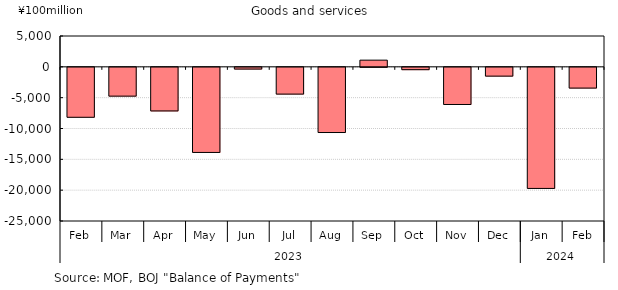
| Category | Series 0 |
|---|---|
| 0 | -8101 |
| 1 | -4671 |
| 2 | -7069 |
| 3 | -13801 |
| 4 | -282 |
| 5 | -4342 |
| 6 | -10571 |
| 7 | 1084 |
| 8 | -380 |
| 9 | -6025 |
| 10 | -1426 |
| 11 | -19638 |
| 12 | -3365 |